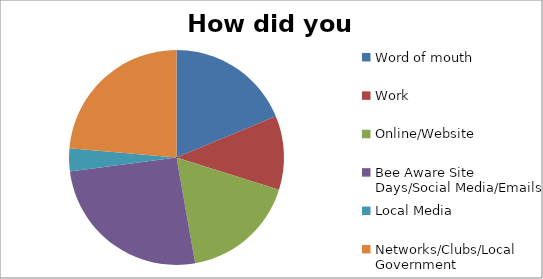
| Category | Series 0 |
|---|---|
| Word of mouth | 18.75 |
| Work | 11.111 |
| Online/Website | 17.361 |
| Bee Aware Site Days/Social Media/Emails | 25.694 |
| Local Media | 3.472 |
| Networks/Clubs/Local Government  | 23.611 |